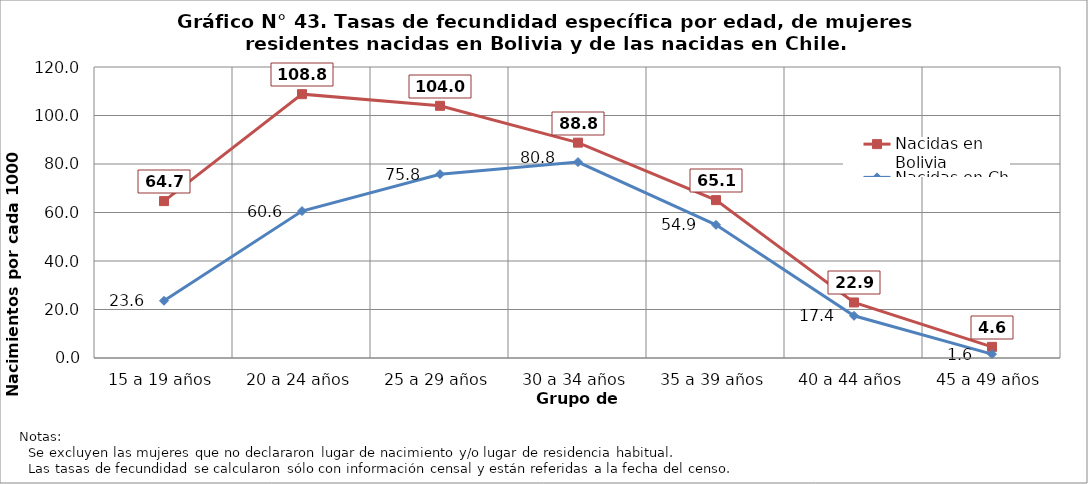
| Category | Nacidas en Bolivia | Nacidas en Chile |
|---|---|---|
| 15 a 19 años | 64.7 | 23.6 |
| 20 a 24 años | 108.8 | 60.6 |
| 25 a 29 años | 104 | 75.8 |
| 30 a 34 años | 88.8 | 80.8 |
| 35 a 39 años | 65.1 | 54.9 |
| 40 a 44 años | 22.9 | 17.4 |
| 45 a 49 años | 4.6 | 1.6 |